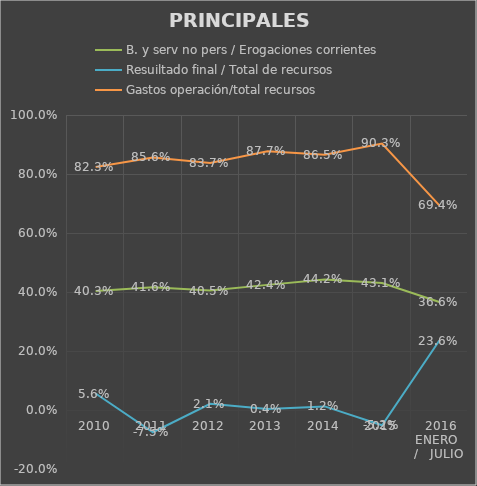
| Category | B. y serv no pers / Erogaciones corrientes | Resuiltado final / Total de recursos | Gastos operación/total recursos |
|---|---|---|---|
| 2010 | 0.403 | 0.056 | 0.823 |
| 2011 | 0.416 | -0.075 | 0.856 |
| 2012 | 0.405 | 0.021 | 0.837 |
| 2013 | 0.424 | 0.004 | 0.877 |
| 2014 | 0.442 | 0.012 | 0.865 |
| 2015 | 0.431 | -0.052 | 0.903 |
|  2016 ENERO  /   JULIO | 0.366 | 0.236 | 0.694 |